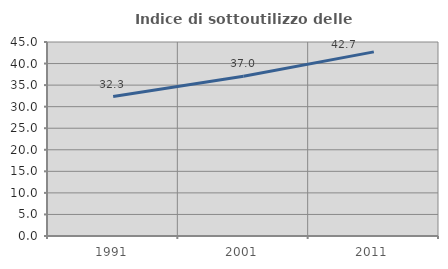
| Category | Indice di sottoutilizzo delle abitazioni  |
|---|---|
| 1991.0 | 32.349 |
| 2001.0 | 37.041 |
| 2011.0 | 42.707 |